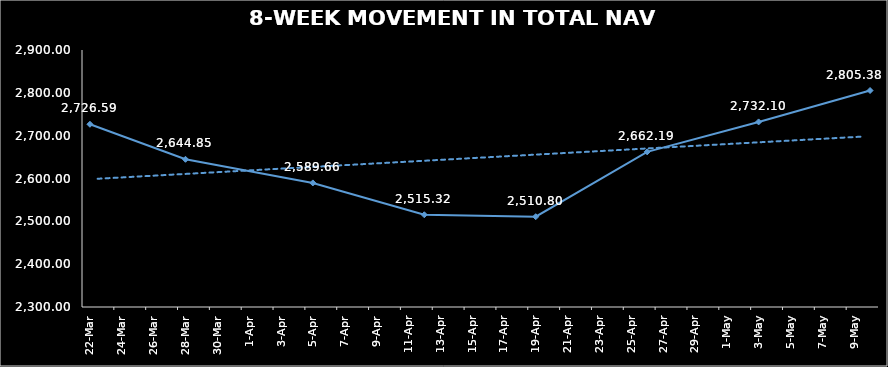
| Category | TOTAL NAV |
|---|---|
| 2024-03-22 | 2726.59 |
| 2024-03-28 | 2644.848 |
| 2024-04-05 | 2589.664 |
| 2024-04-12 | 2515.322 |
| 2024-04-19 | 2510.798 |
| 2024-04-26 | 2662.194 |
| 2024-05-03 | 2732.096 |
| 2024-05-10 | 2805.38 |